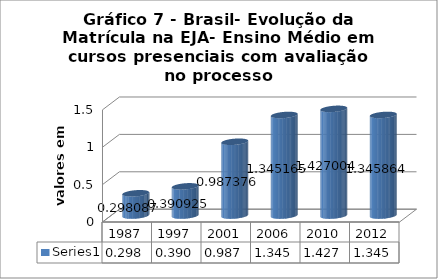
| Category | Series 0 |
|---|---|
| 1987.0 | 0.298 |
| 1997.0 | 0.391 |
| 2001.0 | 0.987 |
| 2006.0 | 1.345 |
| 2010.0 | 1.427 |
| 2012.0 | 1.346 |